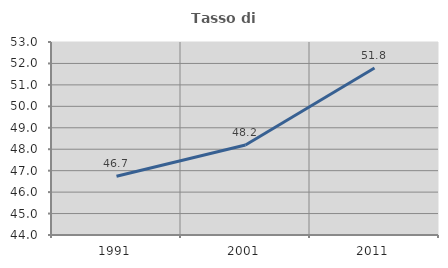
| Category | Tasso di occupazione   |
|---|---|
| 1991.0 | 46.739 |
| 2001.0 | 48.197 |
| 2011.0 | 51.789 |